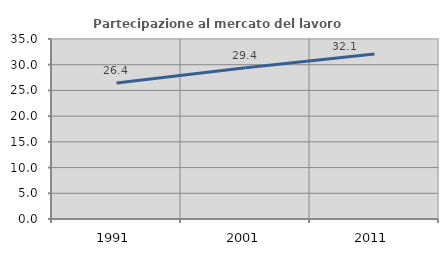
| Category | Partecipazione al mercato del lavoro  femminile |
|---|---|
| 1991.0 | 26.447 |
| 2001.0 | 29.429 |
| 2011.0 | 32.095 |